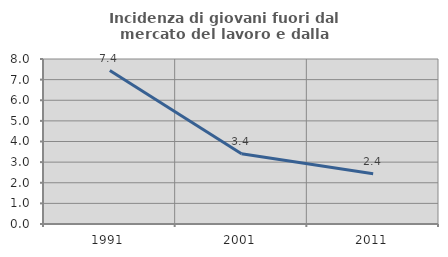
| Category | Incidenza di giovani fuori dal mercato del lavoro e dalla formazione  |
|---|---|
| 1991.0 | 7.438 |
| 2001.0 | 3.409 |
| 2011.0 | 2.439 |